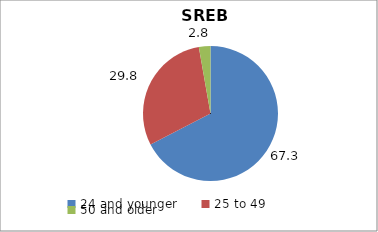
| Category | Series 0 | Series 1 |
|---|---|---|
| 24 and younger | 67.308 | 67.308 |
| 25 to 49 | 29.76 | 29.76 |
| 50 and older | 2.769 | 2.769 |